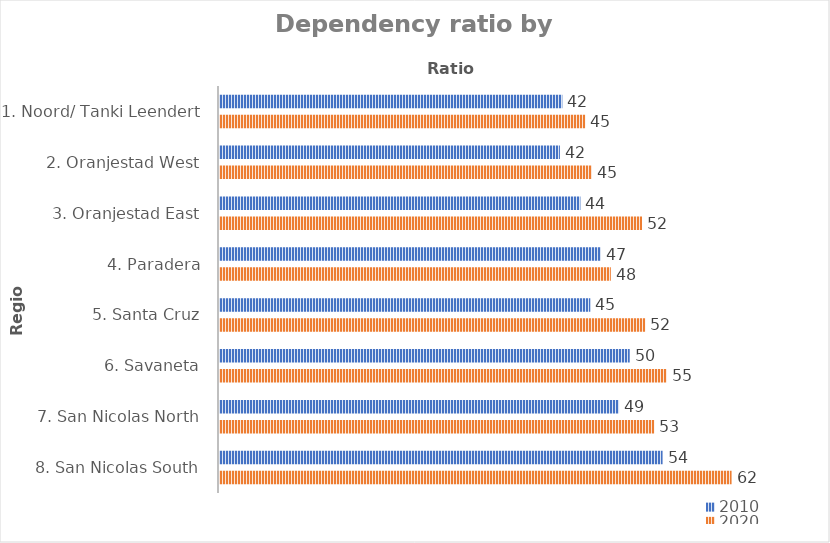
| Category | 2010 | 2020 |
|---|---|---|
| 1. Noord/ Tanki Leendert | 41.8 | 44.6 |
| 2. Oranjestad West | 41.5 | 45.4 |
| 3. Oranjestad East | 44 | 51.5 |
| 4. Paradera | 46.5 | 47.7 |
| 5. Santa Cruz | 45.2 | 51.9 |
| 6. Savaneta | 50 | 54.5 |
| 7. San Nicolas North | 48.7 | 53 |
| 8. San Nicolas South | 54 | 62.4 |